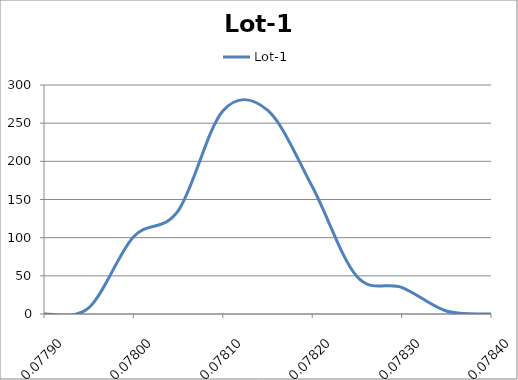
| Category | Lot-1 |
|---|---|
| 0.0779 | 0 |
| 0.07795 | 8 |
| 0.078 | 101 |
| 0.07805 | 135 |
| 0.0781 | 266 |
| 0.07815 | 267 |
| 0.0782 | 167 |
| 0.0782500000000001 | 49 |
| 0.0783000000000001 | 35 |
| 0.0783500000000001 | 4 |
| 0.0784000000000001 | 0 |